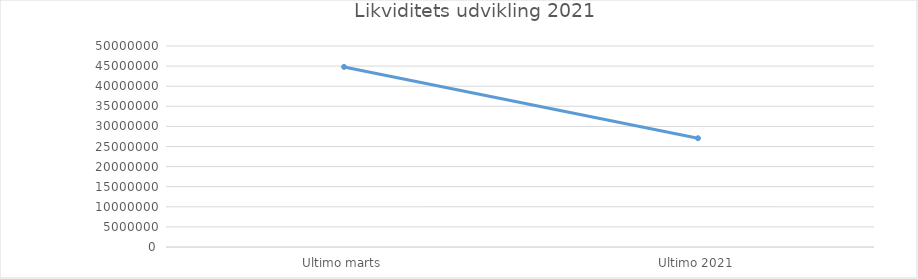
| Category | Ultimo marts Ultimo 2021 |
|---|---|
| Ultimo marts | 44797926.634 |
| Ultimo 2021 | 27058609.528 |